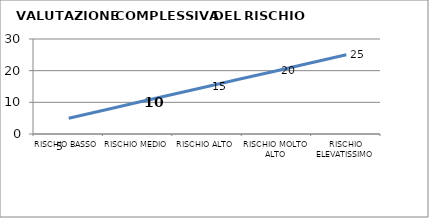
| Category | Series 0 |
|---|---|
| RISCHIO BASSO | 5 |
| RISCHIO MEDIO | 10 |
| RISCHIO ALTO | 15 |
| RISCHIO MOLTO ALTO | 20 |
| RISCHIO ELEVATISSIMO | 25 |